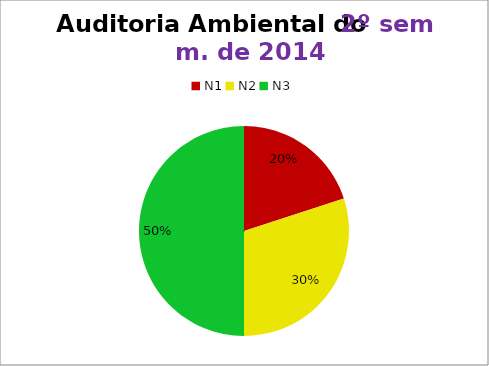
| Category | 2º/14 |
|---|---|
| N1 | 6 |
| N2 | 9 |
| N3 | 15 |